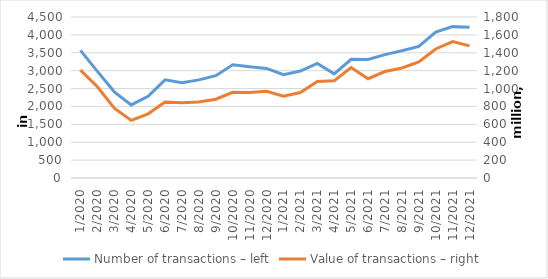
| Category | Number of transactions – left |
|---|---|
| 1/2020 | 3566905 |
| 2/2020 | 2979757 |
| 3/2020 | 2408904 |
| 4/2020 | 2042680 |
| 5/2020 | 2283539 |
| 6/2020 | 2743315 |
| 7/2020 | 2659954 |
| 8/2020 | 2741896 |
| 9/2020 | 2859464 |
| 10/2020 | 3165602 |
| 11/2020 | 3107930 |
| 12/2020 | 3062223 |
| 1/2021 | 2885841 |
| 2/2021 | 2990269 |
| 3/2021 | 3203975 |
| 4/2021 | 2912983 |
| 5/2021 | 3318432 |
| 6/2021 | 3312133 |
| 7/2021 | 3448355 |
| 8/2021 | 3557999 |
| 9/2021 | 3676273 |
| 10/2021 | 4077123 |
| 11/2021 | 4230737 |
| 12/2021 | 4210962 |